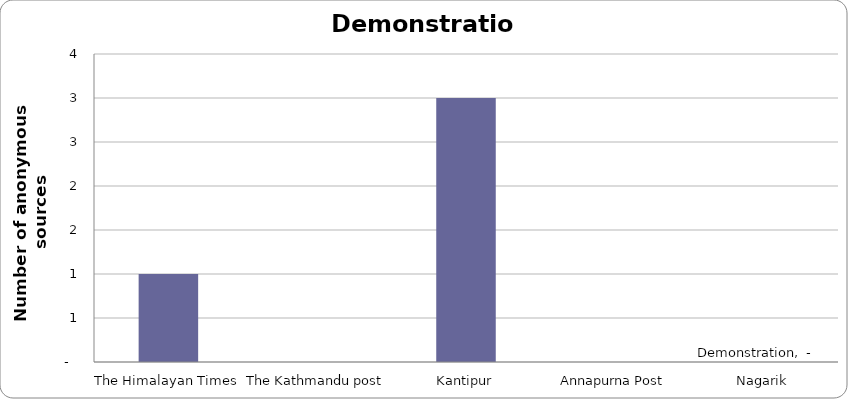
| Category | Demonstration |
|---|---|
| The Himalayan Times | 1 |
| The Kathmandu post | 0 |
| Kantipur | 3 |
| Annapurna Post | 0 |
| Nagarik | 0 |